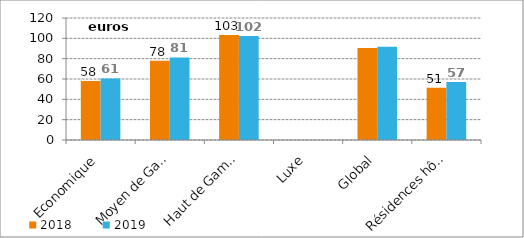
| Category | 2018 | 2019 |
|---|---|---|
| Economique | 57.949 | 60.525 |
| Moyen de Gamme | 77.97 | 81.223 |
| Haut de Gamme | 103.188 | 102.384 |
| Luxe | 0 | 0 |
| Global | 90.487 | 91.665 |
| Résidences hôtelières | 51.387 | 57.153 |